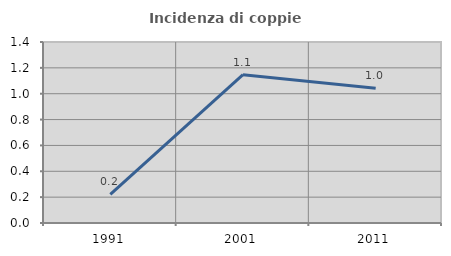
| Category | Incidenza di coppie miste |
|---|---|
| 1991.0 | 0.221 |
| 2001.0 | 1.147 |
| 2011.0 | 1.043 |